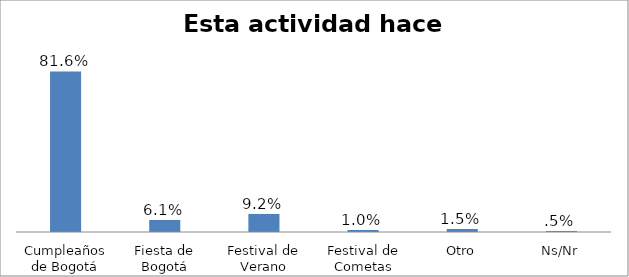
| Category | Series 0 |
|---|---|
| Cumpleaños de Bogotá | 0.816 |
| Fiesta de Bogotá | 0.061 |
| Festival de Verano | 0.092 |
| Festival de Cometas | 0.01 |
| Otro | 0.015 |
| Ns/Nr | 0.005 |